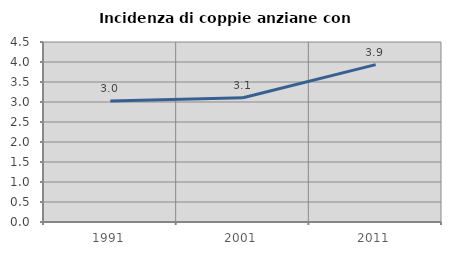
| Category | Incidenza di coppie anziane con figli |
|---|---|
| 1991.0 | 3.025 |
| 2001.0 | 3.106 |
| 2011.0 | 3.935 |